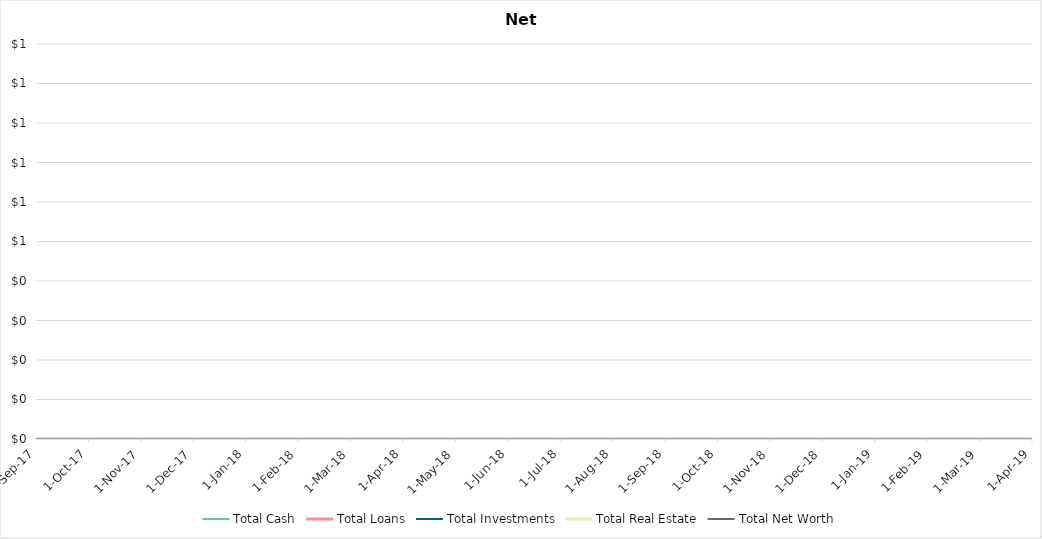
| Category | Total Cash | Total Loans | Total Investments | Total Real Estate | Total Net Worth |
|---|---|---|---|---|---|
| 2017-09-30 | 0 | 0 | 0 | 0 | 0 |
| 2017-10-31 | 0 | 0 | 0 | 0 | 0 |
| 2017-11-30 | 0 | 0 | 0 | 0 | 0 |
| 2017-12-31 | 0 | 0 | 0 | 0 | 0 |
| 2018-01-31 | 0 | 0 | 0 | 0 | 0 |
| 2018-02-28 | 0 | 0 | 0 | 0 | 0 |
| 2018-03-31 | 0 | 0 | 0 | 0 | 0 |
| 2018-04-30 | 0 | 0 | 0 | 0 | 0 |
| 2018-05-31 | 0 | 0 | 0 | 0 | 0 |
| 2018-06-30 | 0 | 0 | 0 | 0 | 0 |
| 2018-07-31 | 0 | 0 | 0 | 0 | 0 |
| 2018-08-31 | 0 | 0 | 0 | 0 | 0 |
| 2018-09-30 | 0 | 0 | 0 | 0 | 0 |
| 2018-10-31 | 0 | 0 | 0 | 0 | 0 |
| 2018-11-30 | 0 | 0 | 0 | 0 | 0 |
| 2018-12-31 | 0 | 0 | 0 | 0 | 0 |
| 2019-01-31 | 0 | 0 | 0 | 0 | 0 |
| 2019-02-28 | 0 | 0 | 0 | 0 | 0 |
| 2019-03-31 | 0 | 0 | 0 | 0 | 0 |
| 2019-04-30 | 0 | 0 | 0 | 0 | 0 |